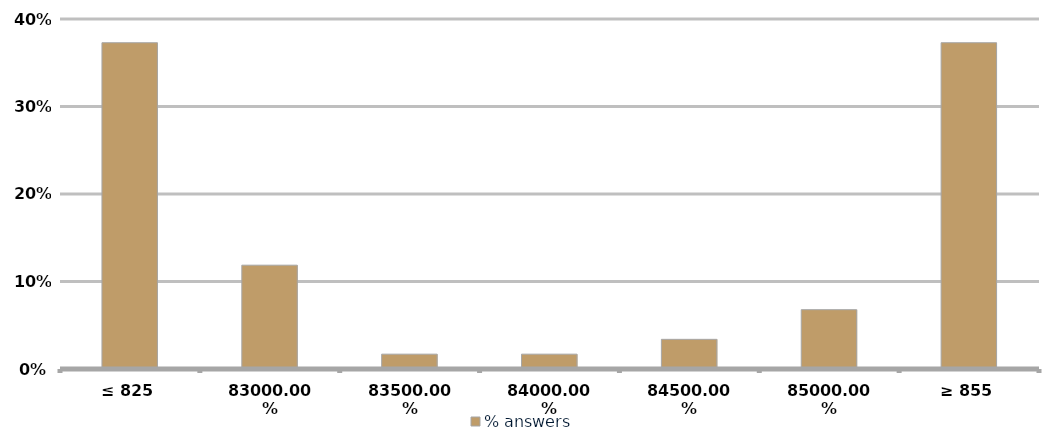
| Category | % answers |
|---|---|
| ≤ 825 | 0.373 |
| 830 | 0.119 |
| 835 | 0.017 |
| 840 | 0.017 |
| 845 | 0.034 |
| 850 | 0.068 |
| ≥ 855 | 0.373 |